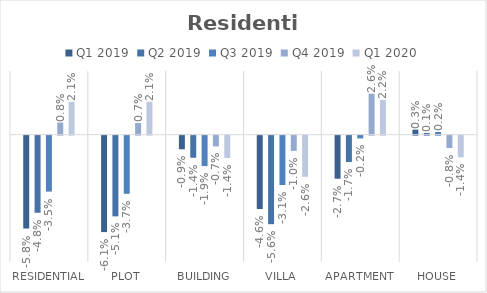
| Category | Q1 2019 | Q2 2019 | Q3 2019 | Q4 2019 | Q1 2020 |
|---|---|---|---|---|---|
| Residential | -0.058 | -0.048 | -0.035 | 0.008 | 0.021 |
| Plot | -0.061 | -0.051 | -0.037 | 0.007 | 0.021 |
| Building | -0.009 | -0.014 | -0.019 | -0.007 | -0.014 |
| Villa | -0.046 | -0.056 | -0.031 | -0.01 | -0.026 |
| Apartment | -0.027 | -0.017 | -0.002 | 0.026 | 0.022 |
| House | 0.003 | 0.001 | 0.002 | -0.008 | -0.014 |